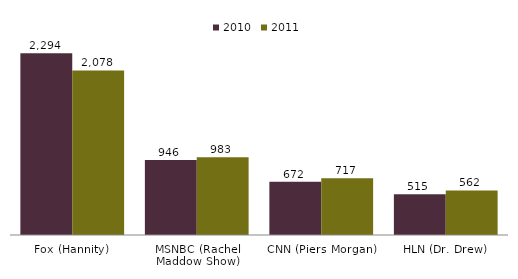
| Category | 2010 | 2011 |
|---|---|---|
| Fox (Hannity) | 2294 | 2078 |
| MSNBC (Rachel Maddow Show) | 946 | 983 |
| CNN (Piers Morgan) | 672 | 717 |
| HLN (Dr. Drew) | 515 | 562 |